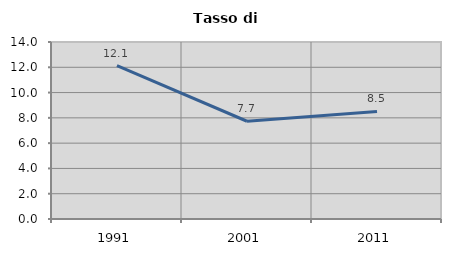
| Category | Tasso di disoccupazione   |
|---|---|
| 1991.0 | 12.135 |
| 2001.0 | 7.731 |
| 2011.0 | 8.504 |